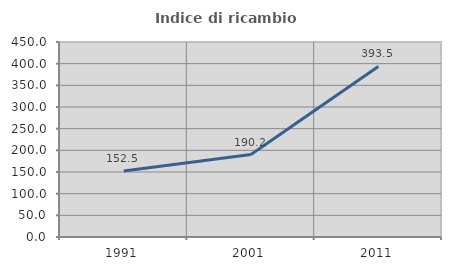
| Category | Indice di ricambio occupazionale  |
|---|---|
| 1991.0 | 152.5 |
| 2001.0 | 190.244 |
| 2011.0 | 393.548 |